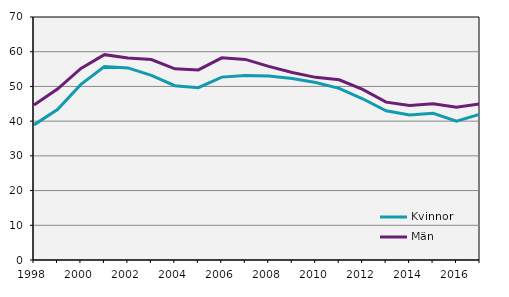
| Category | Kvinnor | Män |
|---|---|---|
| 1998.0 | 38.925 | 44.655 |
| 1999.0 | 43.325 | 49.244 |
| 2000.0 | 50.59 | 55.19 |
| 2001.0 | 55.758 | 59.15 |
| 2002.0 | 55.326 | 58.186 |
| 2003.0 | 53.17 | 57.758 |
| 2004.0 | 50.207 | 55.064 |
| 2005.0 | 49.629 | 54.759 |
| 2006.0 | 52.687 | 58.225 |
| 2007.0 | 53.163 | 57.779 |
| 2008.0 | 53.002 | 55.787 |
| 2009.0 | 52.267 | 53.994 |
| 2010.0 | 51.126 | 52.615 |
| 2011.0 | 49.444 | 51.908 |
| 2012.0 | 46.442 | 49.139 |
| 2013.0 | 42.982 | 45.47 |
| 2014.0 | 41.785 | 44.488 |
| 2015.0 | 42.268 | 44.996 |
| 2016.0 | 40 | 44 |
| 2017.0 | 42 | 45 |